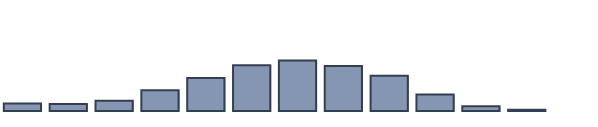
| Category | Series 0 |
|---|---|
| 0 | 2.696 |
| 1 | 2.522 |
| 2 | 3.696 |
| 3 | 7.435 |
| 4 | 11.913 |
| 5 | 16.522 |
| 6 | 18.174 |
| 7 | 16.261 |
| 8 | 12.739 |
| 9 | 5.913 |
| 10 | 1.696 |
| 11 | 0.435 |
| 12 | 0 |